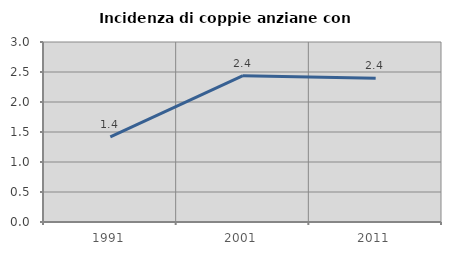
| Category | Incidenza di coppie anziane con figli |
|---|---|
| 1991.0 | 1.42 |
| 2001.0 | 2.439 |
| 2011.0 | 2.397 |